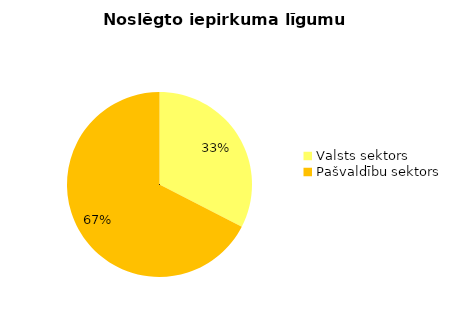
| Category | Noslēgto iepirkuma līgumu skaits |
|---|---|
| Valsts sektors | 14 |
| Pašvaldību sektors | 29 |